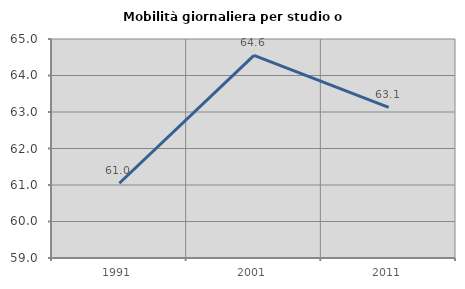
| Category | Mobilità giornaliera per studio o lavoro |
|---|---|
| 1991.0 | 61.048 |
| 2001.0 | 64.551 |
| 2011.0 | 63.127 |